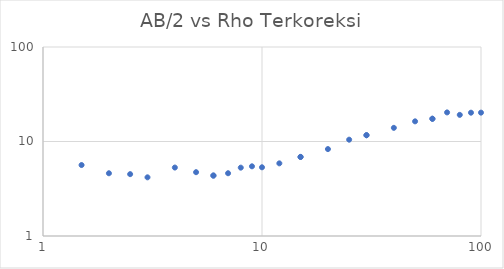
| Category | Series 0 |
|---|---|
| 1.5 | 5.635 |
| 2.0 | 4.612 |
| 2.5 | 4.513 |
| 3.0 | 4.177 |
| 4.0 | 5.301 |
| 5.0 | 4.735 |
| 6.0 | 4.361 |
| 6.0 | 4.361 |
| 7.0 | 4.615 |
| 8.0 | 5.288 |
| 9.0 | 5.464 |
| 10.0 | 5.334 |
| 12.0 | 5.872 |
| 15.0 | 6.865 |
| 15.0 | 6.865 |
| 20.0 | 8.314 |
| 25.0 | 10.452 |
| 30.0 | 11.653 |
| 30.0 | 11.653 |
| 40.0 | 13.946 |
| 50.0 | 16.342 |
| 60.0 | 17.408 |
| 60.0 | 17.408 |
| 70.0 | 20.316 |
| 80.0 | 19.133 |
| 90.0 | 20.177 |
| 100.0 | 20.205 |